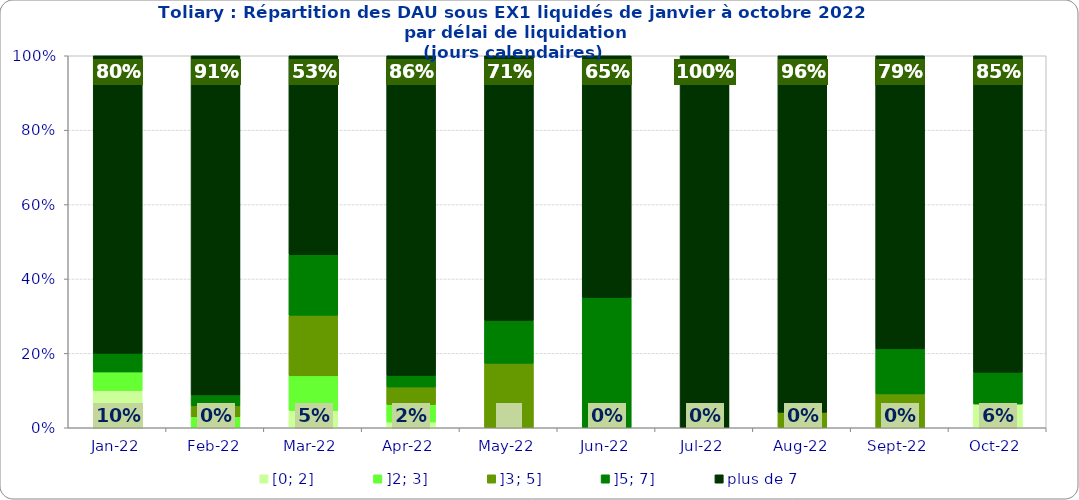
| Category | [0; 2] | ]2; 3] | ]3; 5] | ]5; 7] | plus de 7 |
|---|---|---|---|---|---|
| 2022-01-01 | 0.1 | 0.05 | 0 | 0.05 | 0.8 |
| 2022-02-01 | 0 | 0.029 | 0.029 | 0.029 | 0.912 |
| 2022-03-01 | 0.047 | 0.093 | 0.163 | 0.163 | 0.535 |
| 2022-04-01 | 0.016 | 0.047 | 0.047 | 0.031 | 0.859 |
| 2022-05-01 | 0 | 0 | 0.173 | 0.115 | 0.712 |
| 2022-06-01 | 0 | 0 | 0 | 0.35 | 0.65 |
| 2022-07-01 | 0 | 0 | 0 | 0 | 1 |
| 2022-08-01 | 0 | 0 | 0.042 | 0 | 0.958 |
| 2022-09-01 | 0 | 0 | 0.091 | 0.121 | 0.788 |
| 2022-10-01 | 0.064 | 0 | 0 | 0.085 | 0.851 |